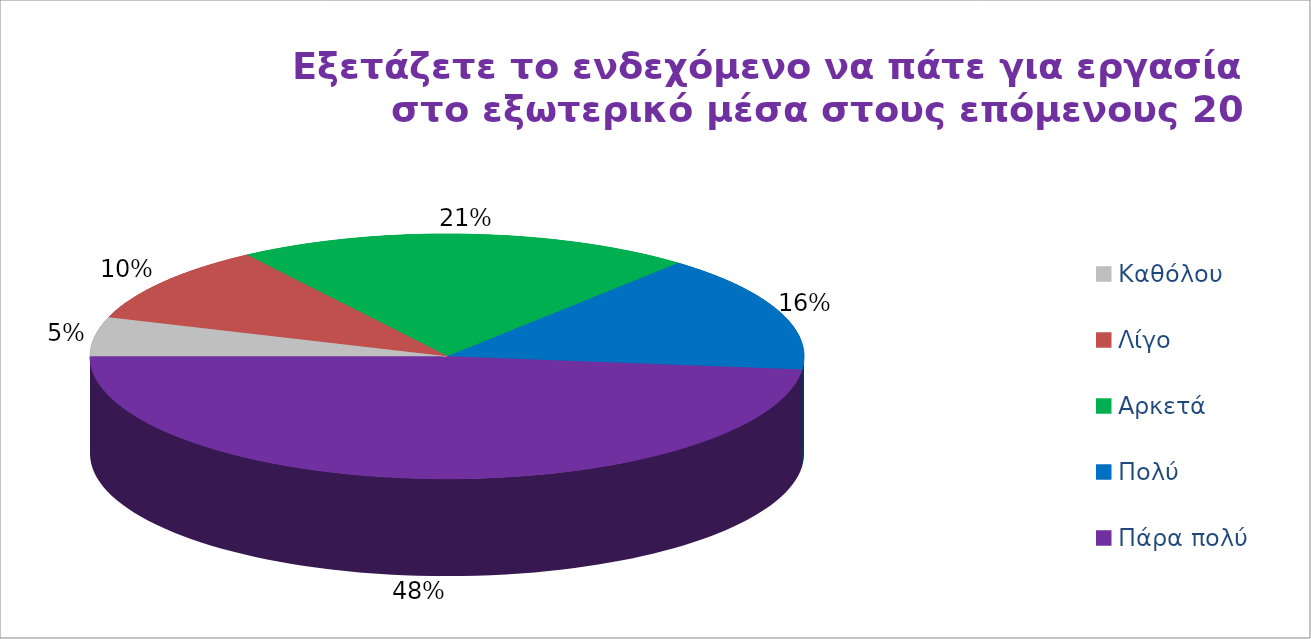
| Category | Series 2 | Series 1 | Series 0 |
|---|---|---|---|
| Καθόλου | 3 | 6 | 2 |
| Λίγο | 6 | 13 | 7 |
| Αρκετά | 12 | 12 | 30 |
| Πολύ | 9 | 14 | 9 |
| Πάρα πολύ | 28 | 13 | 10 |